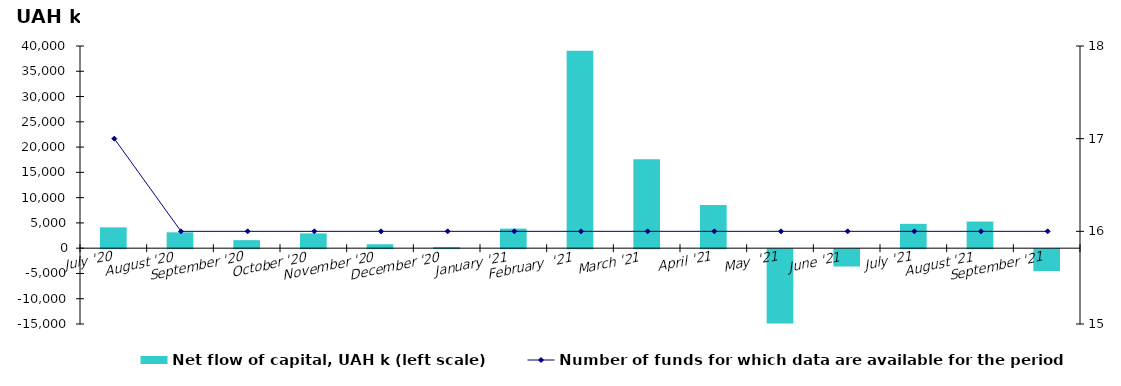
| Category | Net flow of capital, UAH k (left scale) |
|---|---|
| July '20 | 4118.162 |
| August '20 | 3141.082 |
| September '20 | 1590.018 |
| October '20 | 2925.693 |
| November '20 | 777.855 |
| December '20 | 224.618 |
| January '21 | 3870.284 |
| February  '21 | 39078.998 |
| March '21 | 17584.613 |
| April '21 | 8556.253 |
| May  '21 | -14682.751 |
| June '21 | -3430.992 |
| July '21 | 4815.189 |
| August '21 | 5272.794 |
| September '21 | -4323.731 |